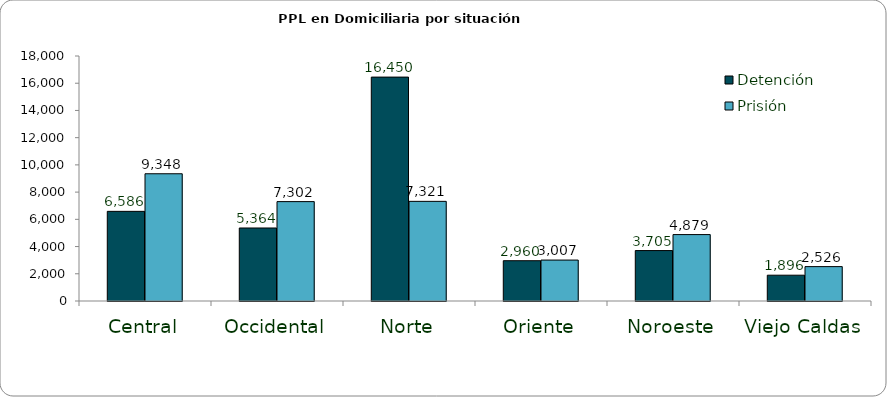
| Category | Detención | Prisión |
|---|---|---|
| Central | 6586 | 9348 |
| Occidental | 5364 | 7302 |
| Norte | 16450 | 7321 |
| Oriente | 2960 | 3007 |
| Noroeste | 3705 | 4879 |
| Viejo Caldas | 1896 | 2526 |